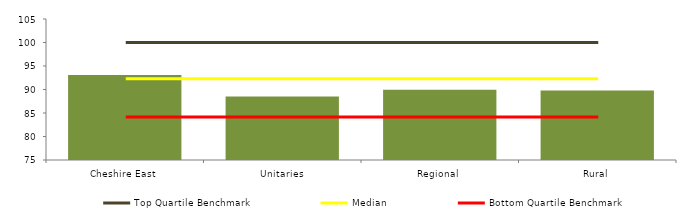
| Category | Block Data |
|---|---|
| Cheshire East | 93.103 |
| Unitaries | 88.533 |
| Regional | 89.935 |
|  Rural  | 89.799 |